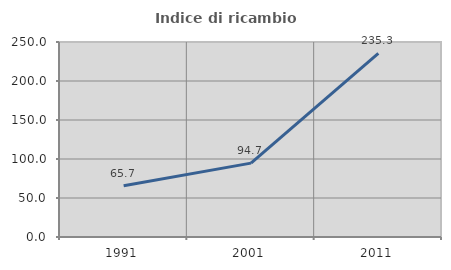
| Category | Indice di ricambio occupazionale  |
|---|---|
| 1991.0 | 65.714 |
| 2001.0 | 94.737 |
| 2011.0 | 235.294 |